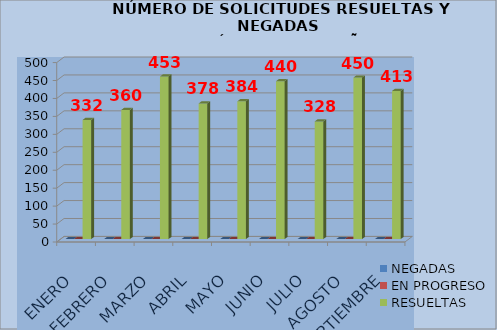
| Category | NEGADAS | EN PROGRESO | RESUELTAS |
|---|---|---|---|
| ENERO | 0 | 0 | 332 |
| FEBRERO | 0 | 0 | 360 |
| MARZO | 0 | 0 | 453 |
| ABRIL | 0 | 0 | 378 |
| MAYO | 0 | 0 | 384 |
| JUNIO | 0 | 0 | 440 |
| JULIO | 0 | 0 | 328 |
| AGOSTO | 0 | 0 | 450 |
| SEPTIEMBRE | 0 | 0 | 413 |